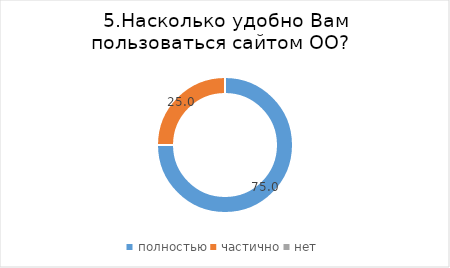
| Category | Series 0 |
|---|---|
| полностью | 75 |
| частично | 25 |
| нет | 0 |